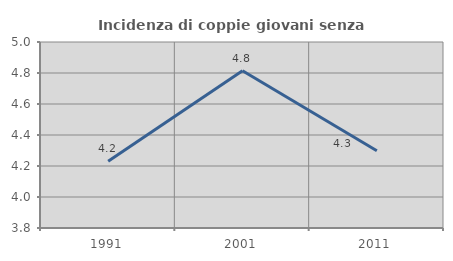
| Category | Incidenza di coppie giovani senza figli |
|---|---|
| 1991.0 | 4.231 |
| 2001.0 | 4.815 |
| 2011.0 | 4.299 |